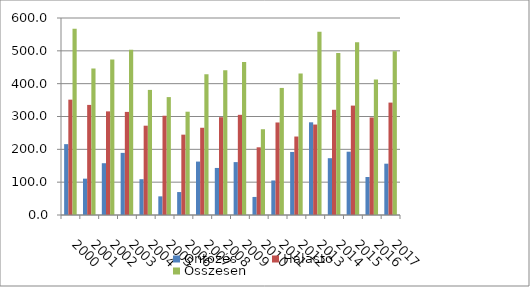
| Category | Öntözés | Halastó | Összesen |
|---|---|---|---|
| 2000.0 | 215.8 | 351.3 | 567.1 |
| 2001.0 | 110.7 | 335.3 | 446 |
| 2002.0 | 157.7 | 315.6 | 473.3 |
| 2003.0 | 189.2 | 314 | 503.2 |
| 2004.0 | 109 | 272 | 381 |
| 2005.0 | 56.8 | 302.3 | 359.1 |
| 2006.0 | 69.9 | 244.7 | 314.6 |
| 2007.0 | 162.7 | 265.7 | 428.4 |
| 2008.0 | 143.3 | 297.8 | 441.1 |
| 2009.0 | 161.1 | 305.1 | 466.2 |
| 2010.0 | 55 | 206.2 | 261.2 |
| 2011.0 | 105.2 | 281.8 | 387 |
| 2012.0 | 192 | 239.01 | 431.01 |
| 2013.0 | 282.3 | 275.478 | 557.778 |
| 2014.0 | 173 | 320.4 | 493.4 |
| 2015.0 | 192.8 | 333.2 | 526 |
| 2016.0 | 115.788 | 297.111 | 412.899 |
| 2017.0 | 156.288 | 342.358 | 498.646 |